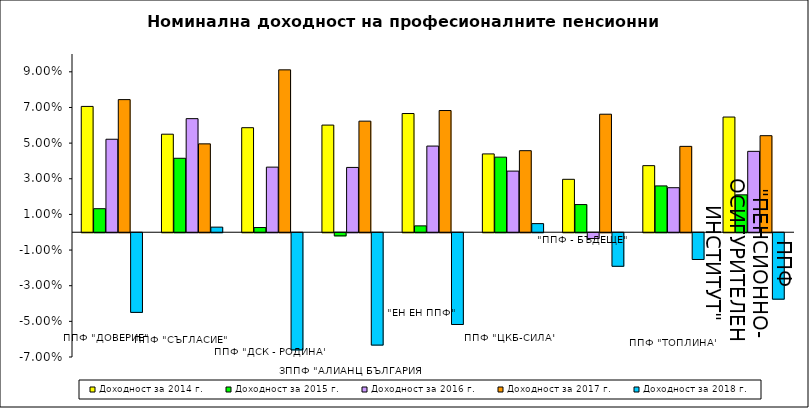
| Category | Доходност за 2014 г. | Доходност за 2015 г. | Доходност за 2016 г. | Доходност за 2017 г. | Доходност за 2018 г. |
|---|---|---|---|---|---|
| ППФ "ДОВЕРИЕ"  | 0.071 | 0.013 | 0.052 | 0.074 | -0.045 |
| ППФ "СЪГЛАСИЕ"  | 0.055 | 0.042 | 0.064 | 0.05 | 0.003 |
| ППФ "ДСК - РОДИНА" | 0.059 | 0.003 | 0.037 | 0.091 | -0.066 |
| ЗППФ "АЛИАНЦ БЪЛГАРИЯ" | 0.06 | -0.002 | 0.036 | 0.062 | -0.063 |
| "ЕН ЕН ППФ" | 0.067 | 0.004 | 0.048 | 0.068 | -0.051 |
| ППФ "ЦКБ-СИЛА" | 0.044 | 0.042 | 0.034 | 0.046 | 0.005 |
| "ППФ - БЪДЕЩЕ" | 0.03 | 0.016 | -0.003 | 0.066 | -0.019 |
| ППФ "ТОПЛИНА" | 0.037 | 0.026 | 0.025 | 0.048 | -0.015 |
| ППФ "ПЕНСИОННООСИГУРИТЕЛЕН ИНСТИТУТ" | 0.065 | 0.021 | 0.045 | 0.054 | -0.037 |